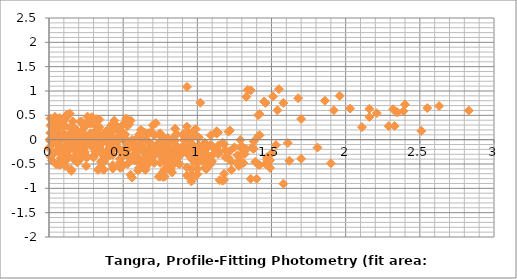
| Category | Series 0 |
|---|---|
| 0.1999999999999993 | -0.095 |
| 0.27999999999999936 | -0.053 |
| 0.3199999999999985 | 0.417 |
| 0.4299999999999997 | -0.125 |
| 0.4399999999999995 | 0.01 |
| 0.47999999999999865 | 0.036 |
| 0.48999999999999844 | 0.026 |
| 0.5 | 0.318 |
| 0.5099999999999998 | -0.029 |
| 0.5399999999999991 | 0.319 |
| 0.6199999999999992 | 0.053 |
| 0.6699999999999999 | 0.134 |
| 0.6699999999999999 | -0.037 |
| 0.7199999999999989 | 0.339 |
| 0.7999999999999989 | -0.043 |
| 0.8699999999999992 | -0.302 |
| 0.9099999999999984 | -0.008 |
| 0.9699999999999989 | -0.203 |
| 1.129999999999999 | 0.172 |
| 1.1499999999999986 | -0.255 |
| 1.25 | -0.158 |
| 1.2799999999999994 | -0.441 |
| 1.2899999999999991 | -0.006 |
| 1.3199999999999985 | -0.292 |
| 1.3699999999999992 | -0.157 |
| 1.379999999999999 | -0.188 |
| 1.4099999999999984 | 0.071 |
| 1.42 | 0.093 |
| 1.4699999999999989 | -0.416 |
| 1.4899999999999984 | -0.426 |
| 1.5 | -0.284 |
| 1.8099999999999987 | -0.162 |
| 1.8999999999999986 | -0.487 |
| 2.83 | 0.597 |
| 0.08000000000000007 | 0.042 |
| 0.11999999999999922 | 0.512 |
| 0.23000000000000043 | -0.031 |
| 0.2400000000000002 | 0.104 |
| 0.27999999999999936 | 0.13 |
| 0.28999999999999915 | 0.121 |
| 0.3000000000000007 | 0.412 |
| 0.3100000000000005 | 0.065 |
| 0.33999999999999986 | 0.413 |
| 0.41999999999999993 | 0.147 |
| 0.47000000000000064 | 0.228 |
| 0.47000000000000064 | 0.057 |
| 0.5199999999999996 | 0.434 |
| 0.5999999999999996 | 0.052 |
| 0.6699999999999999 | -0.208 |
| 0.7099999999999991 | 0.087 |
| 0.7699999999999996 | -0.109 |
| 0.9299999999999997 | 0.267 |
| 0.9499999999999993 | -0.16 |
| 1.0500000000000007 | -0.063 |
| 1.08 | -0.346 |
| 1.0899999999999999 | 0.088 |
| 1.1199999999999992 | -0.197 |
| 1.17 | -0.063 |
| 1.1799999999999997 | -0.094 |
| 1.209999999999999 | 0.165 |
| 1.2200000000000006 | 0.188 |
| 1.2699999999999996 | -0.322 |
| 1.2899999999999991 | -0.331 |
| 1.3000000000000007 | -0.189 |
| 1.6099999999999994 | -0.068 |
| 1.6999999999999993 | -0.392 |
| 2.630000000000001 | 0.692 |
| 0.03999999999999915 | 0.47 |
| 0.15000000000000036 | -0.073 |
| 0.16000000000000014 | 0.062 |
| 0.1999999999999993 | 0.089 |
| 0.20999999999999908 | 0.079 |
| 0.22000000000000064 | 0.37 |
| 0.23000000000000043 | 0.023 |
| 0.2599999999999998 | 0.371 |
| 0.33999999999999986 | 0.106 |
| 0.39000000000000057 | 0.186 |
| 0.39000000000000057 | 0.015 |
| 0.4399999999999995 | 0.392 |
| 0.5199999999999996 | 0.01 |
| 0.5899999999999999 | -0.25 |
| 0.629999999999999 | 0.045 |
| 0.6899999999999995 | -0.15 |
| 0.8499999999999996 | 0.225 |
| 0.8699999999999992 | -0.202 |
| 0.9700000000000006 | -0.105 |
| 1.0 | -0.388 |
| 1.0099999999999998 | 0.046 |
| 1.0399999999999991 | -0.239 |
| 1.0899999999999999 | -0.105 |
| 1.0999999999999996 | -0.136 |
| 1.129999999999999 | 0.123 |
| 1.1400000000000006 | 0.146 |
| 1.1899999999999995 | -0.364 |
| 1.209999999999999 | -0.373 |
| 1.2200000000000006 | -0.231 |
| 1.5299999999999994 | -0.11 |
| 1.6199999999999992 | -0.434 |
| 2.5500000000000007 | 0.65 |
| 0.11000000000000121 | -0.543 |
| 0.120000000000001 | -0.408 |
| 0.16000000000000014 | -0.382 |
| 0.16999999999999993 | -0.391 |
| 0.1800000000000015 | -0.1 |
| 0.19000000000000128 | -0.447 |
| 0.22000000000000064 | -0.099 |
| 0.3000000000000007 | -0.364 |
| 0.3500000000000014 | -0.284 |
| 0.3500000000000014 | -0.455 |
| 0.40000000000000036 | -0.078 |
| 0.4800000000000004 | -0.46 |
| 0.5500000000000007 | -0.72 |
| 0.5899999999999999 | -0.425 |
| 0.6500000000000004 | -0.62 |
| 0.8100000000000005 | -0.245 |
| 0.8300000000000001 | -0.672 |
| 0.9300000000000015 | -0.575 |
| 0.9600000000000009 | -0.858 |
| 0.9700000000000006 | -0.424 |
| 1.0 | -0.709 |
| 1.0500000000000007 | -0.575 |
| 1.0600000000000005 | -0.606 |
| 1.0899999999999999 | -0.347 |
| 1.1000000000000014 | -0.324 |
| 1.1500000000000004 | -0.834 |
| 1.17 | -0.843 |
| 1.1800000000000015 | -0.701 |
| 1.4900000000000002 | -0.58 |
| 1.58 | -0.904 |
| 2.5100000000000016 | 0.18 |
| 0.009999999999999787 | 0.135 |
| 0.049999999999998934 | 0.161 |
| 0.05999999999999872 | 0.152 |
| 0.07000000000000028 | 0.443 |
| 0.08000000000000007 | 0.096 |
| 0.10999999999999943 | 0.444 |
| 0.1899999999999995 | 0.178 |
| 0.2400000000000002 | 0.259 |
| 0.2400000000000002 | 0.088 |
| 0.28999999999999915 | 0.465 |
| 0.3699999999999992 | 0.083 |
| 0.4399999999999995 | -0.177 |
| 0.47999999999999865 | 0.118 |
| 0.5399999999999991 | -0.078 |
| 0.6999999999999993 | 0.297 |
| 0.7199999999999989 | -0.129 |
| 0.8200000000000003 | -0.032 |
| 0.8499999999999996 | -0.315 |
| 0.8599999999999994 | 0.119 |
| 0.8899999999999988 | -0.166 |
| 0.9399999999999995 | -0.032 |
| 0.9499999999999993 | -0.063 |
| 0.9799999999999986 | 0.196 |
| 0.9900000000000002 | 0.218 |
| 1.0399999999999991 | -0.291 |
| 1.0599999999999987 | -0.3 |
| 1.0700000000000003 | -0.159 |
| 1.379999999999999 | -0.037 |
| 1.4699999999999989 | -0.361 |
| 2.4000000000000004 | 0.723 |
| 0.03999999999999915 | 0.026 |
| 0.049999999999998934 | 0.017 |
| 0.0600000000000005 | 0.308 |
| 0.07000000000000028 | -0.039 |
| 0.09999999999999964 | 0.309 |
| 0.17999999999999972 | 0.043 |
| 0.23000000000000043 | 0.124 |
| 0.23000000000000043 | -0.047 |
| 0.27999999999999936 | 0.33 |
| 0.35999999999999943 | -0.052 |
| 0.4299999999999997 | -0.312 |
| 0.46999999999999886 | -0.017 |
| 0.5299999999999994 | -0.213 |
| 0.6899999999999995 | 0.162 |
| 0.7099999999999991 | -0.264 |
| 0.8100000000000005 | -0.167 |
| 0.8399999999999999 | -0.451 |
| 0.8499999999999996 | -0.016 |
| 0.879999999999999 | -0.302 |
| 0.9299999999999997 | -0.167 |
| 0.9399999999999995 | -0.198 |
| 0.9699999999999989 | 0.061 |
| 0.9800000000000004 | 0.083 |
| 1.0299999999999994 | -0.426 |
| 1.049999999999999 | -0.435 |
| 1.0600000000000005 | -0.294 |
| 1.3699999999999992 | -0.172 |
| 1.459999999999999 | -0.496 |
| 2.3900000000000006 | 0.587 |
| 0.009999999999999787 | -0.01 |
| 0.02000000000000135 | 0.282 |
| 0.030000000000001137 | -0.065 |
| 0.0600000000000005 | 0.283 |
| 0.14000000000000057 | 0.017 |
| 0.19000000000000128 | 0.098 |
| 0.19000000000000128 | -0.073 |
| 0.2400000000000002 | 0.303 |
| 0.3200000000000003 | -0.079 |
| 0.39000000000000057 | -0.338 |
| 0.4299999999999997 | -0.043 |
| 0.4900000000000002 | -0.239 |
| 0.6500000000000004 | 0.136 |
| 0.6699999999999999 | -0.291 |
| 0.7700000000000014 | -0.193 |
| 0.8000000000000007 | -0.477 |
| 0.8100000000000005 | -0.042 |
| 0.8399999999999999 | -0.328 |
| 0.8900000000000006 | -0.193 |
| 0.9000000000000004 | -0.224 |
| 0.9299999999999997 | 0.035 |
| 0.9400000000000013 | 0.057 |
| 0.9900000000000002 | -0.452 |
| 1.0099999999999998 | -0.461 |
| 1.0200000000000014 | -0.32 |
| 1.33 | -0.198 |
| 1.42 | -0.523 |
| 2.3500000000000014 | 0.561 |
| 0.010000000000001563 | 0.292 |
| 0.02000000000000135 | -0.056 |
| 0.05000000000000071 | 0.292 |
| 0.13000000000000078 | 0.027 |
| 0.1800000000000015 | 0.107 |
| 0.1800000000000015 | -0.063 |
| 0.23000000000000043 | 0.313 |
| 0.3100000000000005 | -0.069 |
| 0.3800000000000008 | -0.329 |
| 0.41999999999999993 | -0.034 |
| 0.4800000000000004 | -0.229 |
| 0.6400000000000006 | 0.146 |
| 0.6600000000000001 | -0.281 |
| 0.7600000000000016 | -0.184 |
| 0.7900000000000009 | -0.467 |
| 0.8000000000000007 | -0.032 |
| 0.8300000000000001 | -0.318 |
| 0.8800000000000008 | -0.184 |
| 0.8900000000000006 | -0.214 |
| 0.9199999999999999 | 0.044 |
| 0.9300000000000015 | 0.067 |
| 0.9800000000000004 | -0.443 |
| 1.0 | -0.452 |
| 1.0100000000000016 | -0.31 |
| 1.3200000000000003 | -0.189 |
| 1.4100000000000001 | -0.513 |
| 2.3400000000000016 | 0.571 |
| 0.009999999999999787 | -0.347 |
| 0.03999999999999915 | 0.001 |
| 0.11999999999999922 | -0.265 |
| 0.16999999999999993 | -0.184 |
| 0.16999999999999993 | -0.355 |
| 0.21999999999999886 | 0.022 |
| 0.29999999999999893 | -0.36 |
| 0.3699999999999992 | -0.62 |
| 0.40999999999999837 | -0.325 |
| 0.46999999999999886 | -0.521 |
| 0.629999999999999 | -0.146 |
| 0.6499999999999986 | -0.572 |
| 0.75 | -0.475 |
| 0.7799999999999994 | -0.759 |
| 0.7899999999999991 | -0.324 |
| 0.8199999999999985 | -0.61 |
| 0.8699999999999992 | -0.475 |
| 0.879999999999999 | -0.506 |
| 0.9099999999999984 | -0.247 |
| 0.9199999999999999 | -0.225 |
| 0.9699999999999989 | -0.734 |
| 0.9899999999999984 | -0.743 |
| 1.0 | -0.602 |
| 1.3099999999999987 | -0.48 |
| 1.3999999999999986 | -0.805 |
| 2.33 | 0.279 |
| 0.02999999999999936 | 0.348 |
| 0.10999999999999943 | 0.082 |
| 0.16000000000000014 | 0.163 |
| 0.16000000000000014 | -0.008 |
| 0.20999999999999908 | 0.369 |
| 0.28999999999999915 | -0.013 |
| 0.35999999999999943 | -0.273 |
| 0.3999999999999986 | 0.022 |
| 0.4599999999999991 | -0.174 |
| 0.6199999999999992 | 0.201 |
| 0.6399999999999988 | -0.225 |
| 0.7400000000000002 | -0.128 |
| 0.7699999999999996 | -0.412 |
| 0.7799999999999994 | 0.023 |
| 0.8099999999999987 | -0.263 |
| 0.8599999999999994 | -0.128 |
| 0.8699999999999992 | -0.159 |
| 0.8999999999999986 | 0.1 |
| 0.9100000000000001 | 0.122 |
| 0.9599999999999991 | -0.387 |
| 0.9799999999999986 | -0.396 |
| 0.9900000000000002 | -0.255 |
| 1.299999999999999 | -0.133 |
| 1.3899999999999988 | -0.457 |
| 2.3200000000000003 | 0.626 |
| 0.08000000000000007 | -0.266 |
| 0.13000000000000078 | -0.185 |
| 0.13000000000000078 | -0.356 |
| 0.17999999999999972 | 0.021 |
| 0.2599999999999998 | -0.361 |
| 0.33000000000000007 | -0.621 |
| 0.3699999999999992 | -0.326 |
| 0.4299999999999997 | -0.522 |
| 0.5899999999999999 | -0.146 |
| 0.6099999999999994 | -0.573 |
| 0.7100000000000009 | -0.476 |
| 0.7400000000000002 | -0.759 |
| 0.75 | -0.325 |
| 0.7799999999999994 | -0.61 |
| 0.8300000000000001 | -0.476 |
| 0.8399999999999999 | -0.507 |
| 0.8699999999999992 | -0.248 |
| 0.8800000000000008 | -0.226 |
| 0.9299999999999997 | -0.735 |
| 0.9499999999999993 | -0.744 |
| 0.9600000000000009 | -0.603 |
| 1.2699999999999996 | -0.481 |
| 1.3599999999999994 | -0.805 |
| 2.290000000000001 | 0.279 |
| 0.05000000000000071 | 0.081 |
| 0.05000000000000071 | -0.09 |
| 0.09999999999999964 | 0.286 |
| 0.17999999999999972 | -0.096 |
| 0.25 | -0.355 |
| 0.28999999999999915 | -0.06 |
| 0.34999999999999964 | -0.256 |
| 0.5099999999999998 | 0.119 |
| 0.5299999999999994 | -0.308 |
| 0.6300000000000008 | -0.21 |
| 0.6600000000000001 | -0.494 |
| 0.6699999999999999 | -0.059 |
| 0.6999999999999993 | -0.345 |
| 0.75 | -0.21 |
| 0.7599999999999998 | -0.241 |
| 0.7899999999999991 | 0.018 |
| 0.8000000000000007 | 0.04 |
| 0.8499999999999996 | -0.469 |
| 0.8699999999999992 | -0.478 |
| 0.8800000000000008 | -0.337 |
| 1.1899999999999995 | -0.215 |
| 1.2799999999999994 | -0.54 |
| 2.210000000000001 | 0.544 |
| 0.0 | -0.171 |
| 0.049999999999998934 | 0.206 |
| 0.129999999999999 | -0.176 |
| 0.1999999999999993 | -0.436 |
| 0.23999999999999844 | -0.141 |
| 0.29999999999999893 | -0.337 |
| 0.4599999999999991 | 0.039 |
| 0.47999999999999865 | -0.388 |
| 0.5800000000000001 | -0.291 |
| 0.6099999999999994 | -0.574 |
| 0.6199999999999992 | -0.14 |
| 0.6499999999999986 | -0.425 |
| 0.6999999999999993 | -0.291 |
| 0.7099999999999991 | -0.322 |
| 0.7399999999999984 | -0.063 |
| 0.75 | -0.041 |
| 0.7999999999999989 | -0.55 |
| 0.8199999999999985 | -0.559 |
| 0.8300000000000001 | -0.418 |
| 1.1399999999999988 | -0.296 |
| 1.2299999999999986 | -0.62 |
| 2.16 | 0.464 |
| 0.049999999999998934 | 0.377 |
| 0.129999999999999 | -0.005 |
| 0.1999999999999993 | -0.265 |
| 0.23999999999999844 | 0.03 |
| 0.29999999999999893 | -0.166 |
| 0.4599999999999991 | 0.209 |
| 0.47999999999999865 | -0.217 |
| 0.5800000000000001 | -0.12 |
| 0.6099999999999994 | -0.404 |
| 0.6199999999999992 | 0.031 |
| 0.6499999999999986 | -0.255 |
| 0.6999999999999993 | -0.12 |
| 0.7099999999999991 | -0.151 |
| 0.7399999999999984 | 0.108 |
| 0.75 | 0.13 |
| 0.7999999999999989 | -0.379 |
| 0.8199999999999985 | -0.388 |
| 0.8300000000000001 | -0.247 |
| 1.1399999999999988 | -0.125 |
| 1.2299999999999986 | -0.45 |
| 2.16 | 0.634 |
| 0.08000000000000007 | -0.382 |
| 0.15000000000000036 | -0.642 |
| 0.1899999999999995 | -0.347 |
| 0.25 | -0.542 |
| 0.41000000000000014 | -0.167 |
| 0.4299999999999997 | -0.594 |
| 0.5300000000000011 | -0.497 |
| 0.5600000000000005 | -0.78 |
| 0.5700000000000003 | -0.345 |
| 0.5999999999999996 | -0.631 |
| 0.6500000000000004 | -0.497 |
| 0.6600000000000001 | -0.528 |
| 0.6899999999999995 | -0.269 |
| 0.7000000000000011 | -0.246 |
| 0.75 | -0.756 |
| 0.7699999999999996 | -0.765 |
| 0.7800000000000011 | -0.623 |
| 1.0899999999999999 | -0.502 |
| 1.1799999999999997 | -0.826 |
| 2.110000000000001 | 0.258 |
| 0.07000000000000028 | -0.26 |
| 0.10999999999999943 | 0.035 |
| 0.16999999999999993 | -0.16 |
| 0.33000000000000007 | 0.215 |
| 0.34999999999999964 | -0.212 |
| 0.45000000000000107 | -0.115 |
| 0.4800000000000004 | -0.398 |
| 0.4900000000000002 | 0.036 |
| 0.5199999999999996 | -0.249 |
| 0.5700000000000003 | -0.115 |
| 0.5800000000000001 | -0.146 |
| 0.6099999999999994 | 0.113 |
| 0.620000000000001 | 0.136 |
| 0.6699999999999999 | -0.374 |
| 0.6899999999999995 | -0.383 |
| 0.7000000000000011 | -0.241 |
| 1.0099999999999998 | -0.12 |
| 1.0999999999999996 | -0.444 |
| 2.030000000000001 | 0.64 |
| 0.03999999999999915 | 0.295 |
| 0.09999999999999964 | 0.099 |
| 0.2599999999999998 | 0.475 |
| 0.27999999999999936 | 0.048 |
| 0.3800000000000008 | 0.145 |
| 0.41000000000000014 | -0.138 |
| 0.41999999999999993 | 0.296 |
| 0.4499999999999993 | 0.011 |
| 0.5 | 0.145 |
| 0.5099999999999998 | 0.114 |
| 0.5399999999999991 | 0.373 |
| 0.5500000000000007 | 0.395 |
| 0.5999999999999996 | -0.114 |
| 0.6199999999999992 | -0.123 |
| 0.6300000000000008 | 0.018 |
| 0.9399999999999995 | 0.14 |
| 1.0299999999999994 | -0.184 |
| 1.9600000000000009 | 0.9 |
| 0.0600000000000005 | -0.196 |
| 0.22000000000000064 | 0.18 |
| 0.2400000000000002 | -0.247 |
| 0.34000000000000163 | -0.15 |
| 0.370000000000001 | -0.433 |
| 0.3800000000000008 | 0.001 |
| 0.41000000000000014 | -0.284 |
| 0.46000000000000085 | -0.15 |
| 0.47000000000000064 | -0.181 |
| 0.5 | 0.078 |
| 0.5100000000000016 | 0.101 |
| 0.5600000000000005 | -0.409 |
| 0.5800000000000001 | -0.418 |
| 0.5900000000000016 | -0.276 |
| 0.9000000000000004 | -0.155 |
| 0.9900000000000002 | -0.479 |
| 1.9200000000000017 | 0.605 |
| 0.16000000000000014 | 0.375 |
| 0.17999999999999972 | -0.052 |
| 0.28000000000000114 | 0.046 |
| 0.3100000000000005 | -0.238 |
| 0.3200000000000003 | 0.197 |
| 0.34999999999999964 | -0.089 |
| 0.40000000000000036 | 0.046 |
| 0.41000000000000014 | 0.015 |
| 0.4399999999999995 | 0.274 |
| 0.45000000000000107 | 0.296 |
| 0.5 | -0.213 |
| 0.5199999999999996 | -0.222 |
| 0.5300000000000011 | -0.081 |
| 0.8399999999999999 | 0.041 |
| 0.9299999999999997 | -0.284 |
| 1.8600000000000012 | 0.8 |
| 0.019999999999999574 | -0.427 |
| 0.120000000000001 | -0.33 |
| 0.15000000000000036 | -0.613 |
| 0.16000000000000014 | -0.178 |
| 0.1899999999999995 | -0.464 |
| 0.2400000000000002 | -0.329 |
| 0.25 | -0.36 |
| 0.27999999999999936 | -0.101 |
| 0.2900000000000009 | -0.079 |
| 0.33999999999999986 | -0.589 |
| 0.35999999999999943 | -0.598 |
| 0.370000000000001 | -0.456 |
| 0.6799999999999997 | -0.334 |
| 0.7699999999999996 | -0.659 |
| 1.700000000000001 | 0.425 |
| 0.10000000000000142 | 0.097 |
| 0.13000000000000078 | -0.186 |
| 0.14000000000000057 | 0.249 |
| 0.16999999999999993 | -0.037 |
| 0.22000000000000064 | 0.097 |
| 0.23000000000000043 | 0.066 |
| 0.2599999999999998 | 0.325 |
| 0.27000000000000135 | 0.348 |
| 0.3200000000000003 | -0.162 |
| 0.33999999999999986 | -0.171 |
| 0.3500000000000014 | -0.029 |
| 0.6600000000000001 | 0.092 |
| 0.75 | -0.232 |
| 1.6800000000000015 | 0.852 |
| 0.02999999999999936 | -0.283 |
| 0.03999999999999915 | 0.151 |
| 0.06999999999999851 | -0.134 |
| 0.11999999999999922 | 0 |
| 0.129999999999999 | -0.031 |
| 0.15999999999999837 | 0.228 |
| 0.16999999999999993 | 0.251 |
| 0.21999999999999886 | -0.259 |
| 0.23999999999999844 | -0.268 |
| 0.25 | -0.126 |
| 0.5599999999999987 | -0.005 |
| 0.6499999999999986 | -0.329 |
| 1.58 | 0.755 |
| 0.009999999999999787 | 0.435 |
| 0.03999999999999915 | 0.149 |
| 0.08999999999999986 | 0.284 |
| 0.09999999999999964 | 0.253 |
| 0.129999999999999 | 0.512 |
| 0.14000000000000057 | 0.534 |
| 0.1899999999999995 | 0.024 |
| 0.20999999999999908 | 0.015 |
| 0.22000000000000064 | 0.157 |
| 0.5299999999999994 | 0.279 |
| 0.6199999999999992 | -0.046 |
| 1.5500000000000007 | 1.038 |
| 0.02999999999999936 | -0.286 |
| 0.08000000000000007 | -0.151 |
| 0.08999999999999986 | -0.182 |
| 0.11999999999999922 | 0.077 |
| 0.13000000000000078 | 0.099 |
| 0.17999999999999972 | -0.41 |
| 0.1999999999999993 | -0.419 |
| 0.21000000000000085 | -0.278 |
| 0.5199999999999996 | -0.156 |
| 0.6099999999999994 | -0.481 |
| 1.540000000000001 | 0.603 |
| 0.05000000000000071 | 0.135 |
| 0.0600000000000005 | 0.104 |
| 0.08999999999999986 | 0.363 |
| 0.10000000000000142 | 0.385 |
| 0.15000000000000036 | -0.125 |
| 0.16999999999999993 | -0.134 |
| 0.1800000000000015 | 0.008 |
| 0.4900000000000002 | 0.129 |
| 0.5800000000000001 | -0.195 |
| 1.5100000000000016 | 0.889 |
| 0.009999999999999787 | -0.031 |
| 0.03999999999999915 | 0.228 |
| 0.05000000000000071 | 0.25 |
| 0.09999999999999964 | -0.259 |
| 0.11999999999999922 | -0.268 |
| 0.13000000000000078 | -0.127 |
| 0.4399999999999995 | -0.005 |
| 0.5299999999999994 | -0.329 |
| 1.4600000000000009 | 0.754 |
| 0.02999999999999936 | 0.259 |
| 0.040000000000000924 | 0.281 |
| 0.08999999999999986 | -0.228 |
| 0.10999999999999943 | -0.237 |
| 0.120000000000001 | -0.096 |
| 0.4299999999999997 | 0.026 |
| 0.5199999999999996 | -0.299 |
| 1.450000000000001 | 0.785 |
| 0.010000000000001563 | 0.022 |
| 0.0600000000000005 | -0.487 |
| 0.08000000000000007 | -0.496 |
| 0.09000000000000163 | -0.355 |
| 0.40000000000000036 | -0.233 |
| 0.4900000000000002 | -0.557 |
| 1.4200000000000017 | 0.526 |
| 0.049999999999998934 | -0.509 |
| 0.06999999999999851 | -0.519 |
| 0.08000000000000007 | -0.377 |
| 0.3899999999999988 | -0.255 |
| 0.47999999999999865 | -0.58 |
| 1.4100000000000001 | 0.504 |
| 0.019999999999999574 | -0.009 |
| 0.030000000000001137 | 0.132 |
| 0.33999999999999986 | 0.254 |
| 0.4299999999999997 | -0.07 |
| 1.3600000000000012 | 1.014 |
| 0.010000000000001563 | 0.142 |
| 0.3200000000000003 | 0.263 |
| 0.41000000000000014 | -0.061 |
| 1.3400000000000016 | 1.023 |
| 0.3099999999999987 | 0.122 |
| 0.3999999999999986 | -0.203 |
| 1.33 | 0.881 |
| 0.08999999999999986 | -0.324 |
| 1.0200000000000014 | 0.759 |
| 0.9300000000000015 | 1.084 |